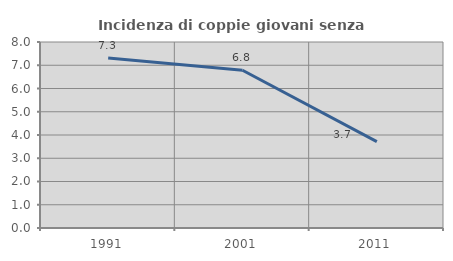
| Category | Incidenza di coppie giovani senza figli |
|---|---|
| 1991.0 | 7.313 |
| 2001.0 | 6.786 |
| 2011.0 | 3.718 |